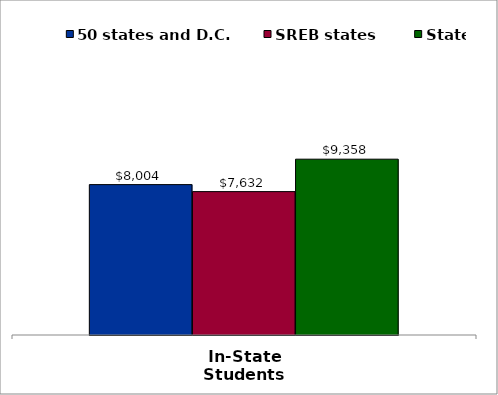
| Category | 50 states and D.C. | SREB states | State |
|---|---|---|---|
| In-State Students | 8004 | 7632 | 9358 |